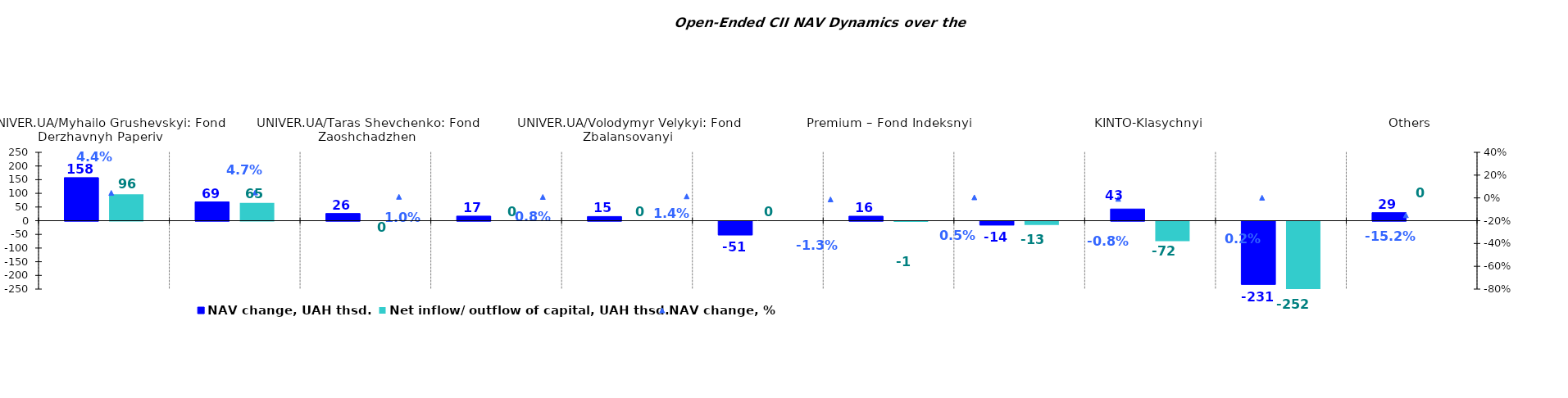
| Category | NAV change, UAH thsd. | Net inflow/ outflow of capital, UAH thsd. |
|---|---|---|
| UNIVER.UA/Myhailo Grushevskyi: Fond Derzhavnyh Paperiv    | 157.551 | 96.427 |
| VSI | 68.693 | 65.05 |
| UNIVER.UA/Taras Shevchenko: Fond Zaoshchadzhen | 26.402 | 0 |
| KINTO-Kaznacheyskyi | 16.808 | 0 |
| UNIVER.UA/Volodymyr Velykyi: Fond Zbalansovanyi | 15.26 | 0 |
| Sofiivskyi | -50.504 | 0 |
| Premium – Fond Indeksnyi | 16.461 | -1.239 |
| Argentum | -14.037 | -12.931 |
| KINTO-Klasychnyi | 42.719 | -71.705 |
| OTP Klasychnyi  | -231.015 | -251.515 |
| Others | 29.366 | 0 |